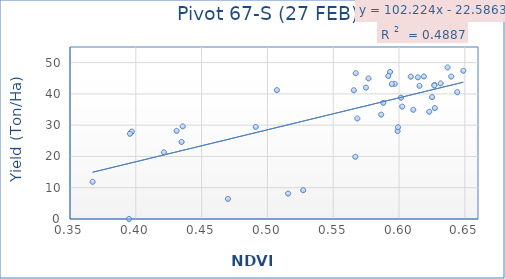
| Category | Series 0 |
|---|---|
| 0.574849 | 42 |
| 0.565666 | 41.17 |
| 0.614301 | 45.3 |
| 0.527149 | 9.2 |
| 0.469992 | 6.43 |
| 0.596763 | 43.2 |
| 0.615564 | 42.57 |
| 0.598896 | 28.1 |
| 0.636911 | 48.45 |
| 0.627224 | 35.45 |
| 0.396305 | 27.6 |
| 0.39698 | 27.95 |
| 0.431003 | 28.18 |
| 0.593181 | 47.01 |
| 0.62511 | 38.97 |
| 0.639675 | 45.55 |
| 0.648817 | 47.39 |
| 0.644224 | 40.53 |
| 0.626923 | 42.88 |
| 0.586443 | 33.37 |
| 0.421316 | 21.32 |
| 0.59923 | 29.32 |
| 0.622977 | 34.3 |
| 0.626799 | 42.66 |
| 0.588014 | 37.14 |
| 0.608919 | 45.5 |
| 0.591814 | 45.73 |
| 0.434788 | 24.63 |
| 0.602433 | 35.94 |
| 0.394884 | 0 |
| 0.576787 | 44.95 |
| 0.594462 | 43.14 |
| 0.610793 | 34.92 |
| 0.566748 | 19.89 |
| 0.567124 | 46.62 |
| 0.60152 | 38.79 |
| 0.618872 | 45.58 |
| 0.568345 | 32.13 |
| 0.395537 | 27.24 |
| 0.367182 | 11.89 |
| 0.5072 | 41.2 |
| 0.435642 | 29.61 |
| 0.63161 | 43.35 |
| 0.491114 | 29.42 |
| 0.515731 | 8.13 |